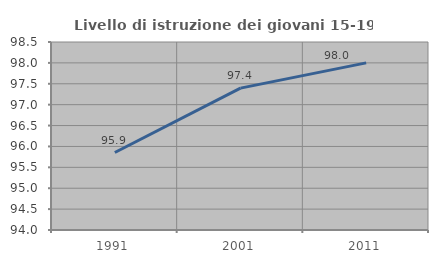
| Category | Livello di istruzione dei giovani 15-19 anni |
|---|---|
| 1991.0 | 95.855 |
| 2001.0 | 97.396 |
| 2011.0 | 98 |